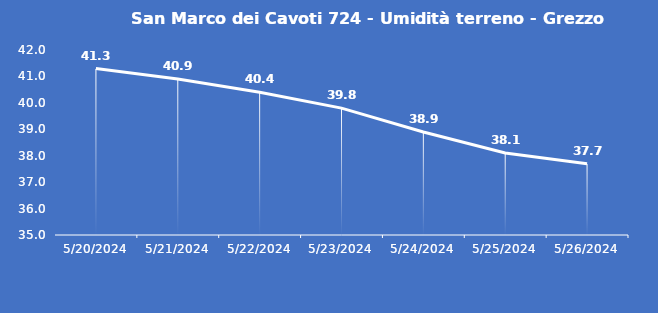
| Category | San Marco dei Cavoti 724 - Umidità terreno - Grezzo (%VWC) |
|---|---|
| 5/20/24 | 41.3 |
| 5/21/24 | 40.9 |
| 5/22/24 | 40.4 |
| 5/23/24 | 39.8 |
| 5/24/24 | 38.9 |
| 5/25/24 | 38.1 |
| 5/26/24 | 37.7 |